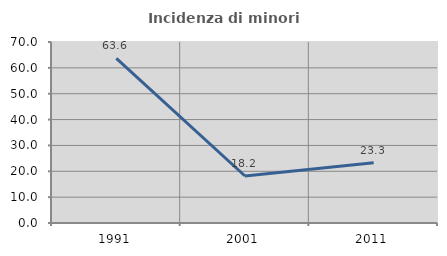
| Category | Incidenza di minori stranieri |
|---|---|
| 1991.0 | 63.636 |
| 2001.0 | 18.182 |
| 2011.0 | 23.301 |